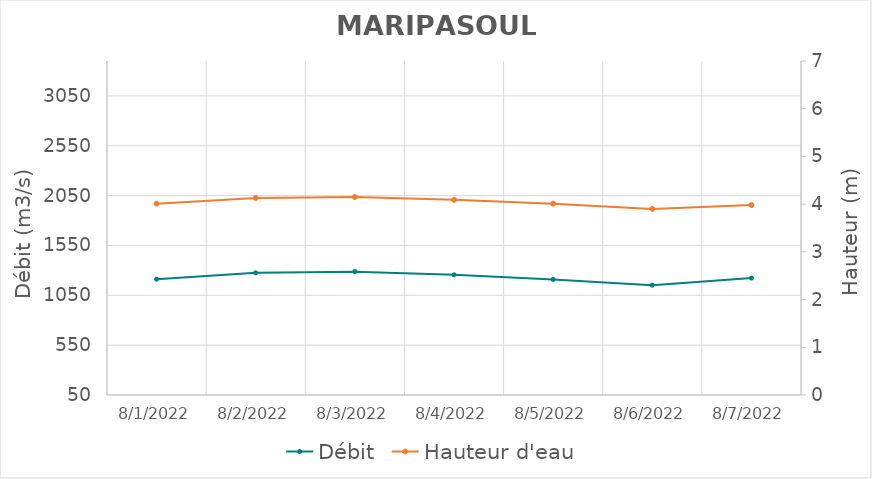
| Category | Débit |
|---|---|
| 6/29/22 | 1614.07 |
| 6/28/22 | 1459.62 |
| 6/27/22 | 1461.92 |
| 6/26/22 | 1544.29 |
| 6/25/22 | 1623.33 |
| 6/24/22 | 1650 |
| 6/23/22 | 1697.5 |